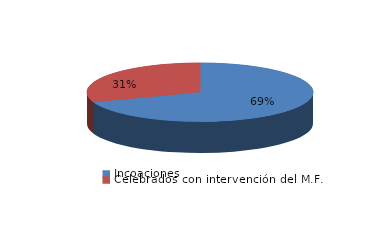
| Category | Series 0 |
|---|---|
| Incoaciones | 4103 |
| Celebrados con intervención del M.F. | 1809 |